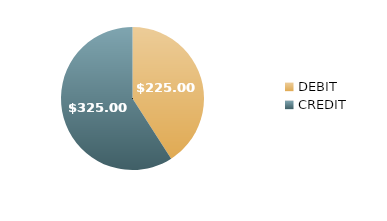
| Category | $225.00 $325.00 |
|---|---|
| DEBIT | 225 |
| CREDIT | 325 |